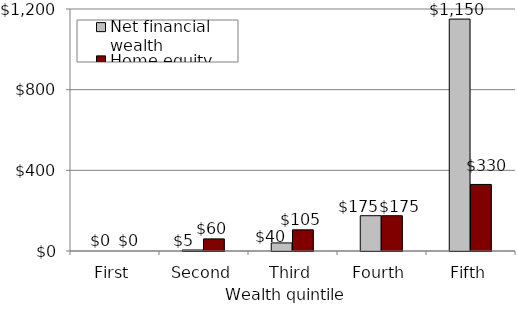
| Category | Net financial wealth | Home equity |
|---|---|---|
| First | 0 | 0 |
| Second | 5000 | 60000 |
| Third | 40000 | 105000 |
| Fourth | 175000 | 175000 |
| Fifth | 1150000 | 330000 |